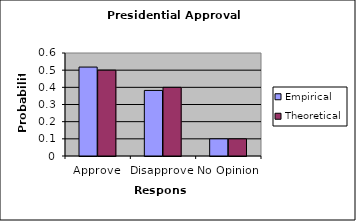
| Category | Empirical | Theoretical |
|---|---|---|
| Approve | 0.518 | 0.5 |
| Disapprove | 0.382 | 0.4 |
| No Opinion | 0.1 | 0.1 |